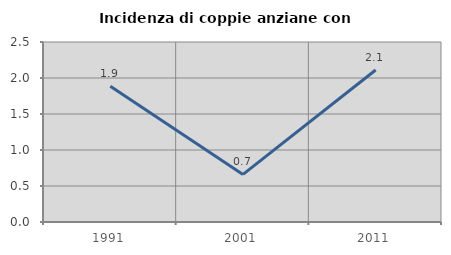
| Category | Incidenza di coppie anziane con figli |
|---|---|
| 1991.0 | 1.887 |
| 2001.0 | 0.661 |
| 2011.0 | 2.11 |